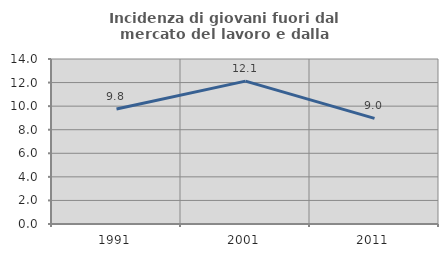
| Category | Incidenza di giovani fuori dal mercato del lavoro e dalla formazione  |
|---|---|
| 1991.0 | 9.756 |
| 2001.0 | 12.121 |
| 2011.0 | 8.959 |